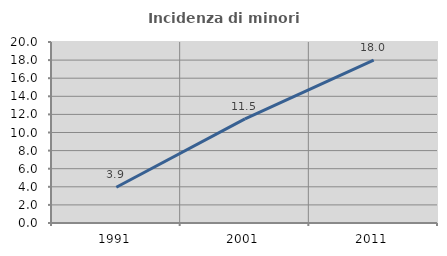
| Category | Incidenza di minori stranieri |
|---|---|
| 1991.0 | 3.947 |
| 2001.0 | 11.504 |
| 2011.0 | 18 |